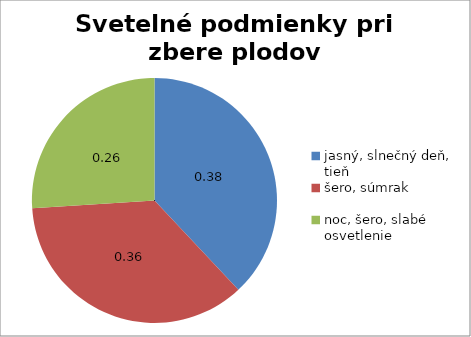
| Category | Series 0 |
|---|---|
| jasný, slnečný deň, tieň | 19 |
| šero, súmrak | 18 |
| noc, šero, slabé osvetlenie | 13 |